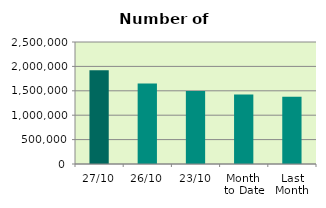
| Category | Series 0 |
|---|---|
| 27/10 | 1922040 |
| 26/10 | 1647828 |
| 23/10 | 1494212 |
| Month 
to Date | 1424072.526 |
| Last
Month | 1376245.636 |